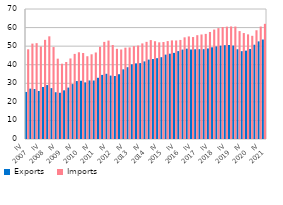
| Category | Exports | Imports |
|---|---|---|
| IV
2007 | 25.329 | 48.308 |
| I | 27.119 | 51.374 |
| II | 26.933 | 51.61 |
| III | 25.857 | 49.805 |
| IV
2008 | 28.012 | 53.397 |
| I | 29.047 | 55.291 |
| II | 27.386 | 49.514 |
| III | 25.185 | 43.261 |
| IV
2009 | 24.894 | 40.545 |
| I | 26.203 | 41.477 |
| II | 27.683 | 43.369 |
| III | 29.565 | 45.825 |
| IV
2010 | 31.191 | 46.693 |
| I | 31.357 | 46.306 |
| II | 30.473 | 44.567 |
| III | 31.517 | 45.617 |
| IV
2011 | 31.492 | 46.585 |
| I | 32.958 | 49.653 |
| II | 34.517 | 52.283 |
| III | 35.113 | 52.996 |
| IV
2012 | 34.147 | 50.591 |
| I | 33.929 | 48.558 |
| II | 34.882 | 48.2 |
| III | 37.504 | 49.191 |
| IV
2013 | 38.661 | 49.328 |
| I | 40.192 | 49.999 |
| II | 40.716 | 50.336 |
| III | 40.868 | 51.483 |
| IV
2014 | 41.777 | 52.316 |
| I | 42.754 | 53.259 |
| II | 43.061 | 52.646 |
| III | 43.514 | 52.056 |
| IV
2015 | 44.047 | 52.212 |
| I | 45.434 | 52.723 |
| II | 45.929 | 53.106 |
| III | 46.377 | 53.046 |
| IV
2016 | 47.324 | 53.345 |
| I | 48.143 | 54.745 |
| II | 48.639 | 55.234 |
| III | 48.189 | 54.9 |
| IV
2017 | 48.316 | 55.9 |
| I | 48.375 | 56.286 |
| II | 48.372 | 56.597 |
| III | 48.747 | 57.632 |
| IV
2018 | 49.381 | 58.925 |
| I | 49.863 | 59.712 |
| II | 50.245 | 60.323 |
| III | 50.504 | 60.495 |
| IV
2019 | 50.614 | 60.611 |
| I | 50.316 | 60.553 |
| II | 48.339 | 58.1 |
| III | 47.3 | 57.047 |
| IV
2020 | 47.591 | 56.35 |
| I | 48.482 | 55.565 |
| II | 50.754 | 58.558 |
| III | 52.569 | 60.559 |
| IV
2021 | 53.561 | 62.016 |